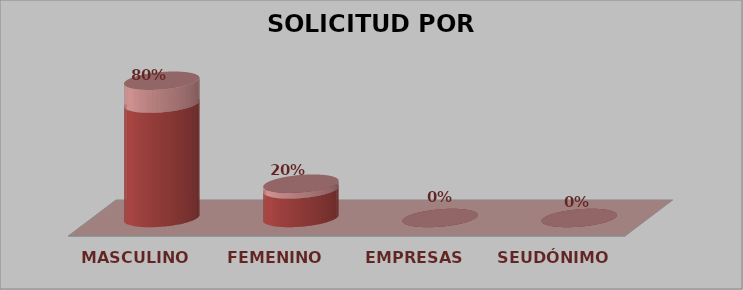
| Category | SOLICITUD POR GÉNERO | Series 1 |
|---|---|---|
| MASCULINO | 4 | 0.8 |
| FEMENINO | 1 | 0.2 |
| EMPRESAS | 0 | 0 |
| SEUDÓNIMO | 0 | 0 |